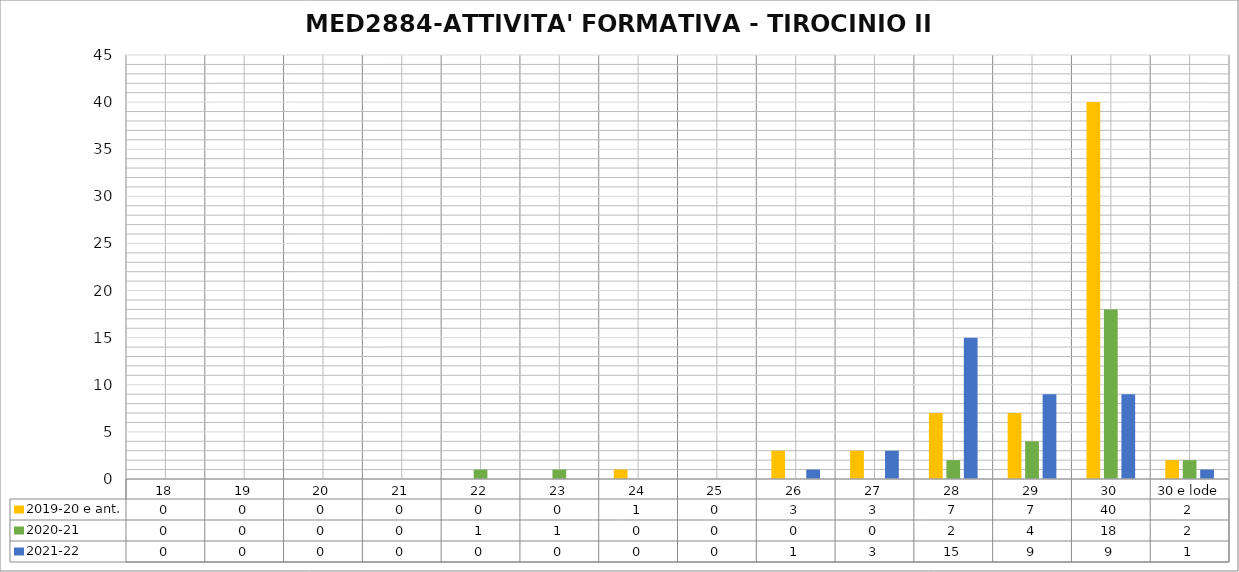
| Category | 2019-20 e ant. | 2020-21 | 2021-22 |
|---|---|---|---|
| 18 | 0 | 0 | 0 |
| 19 | 0 | 0 | 0 |
| 20 | 0 | 0 | 0 |
| 21 | 0 | 0 | 0 |
| 22 | 0 | 1 | 0 |
| 23 | 0 | 1 | 0 |
| 24 | 1 | 0 | 0 |
| 25 | 0 | 0 | 0 |
| 26 | 3 | 0 | 1 |
| 27 | 3 | 0 | 3 |
| 28 | 7 | 2 | 15 |
| 29 | 7 | 4 | 9 |
| 30 | 40 | 18 | 9 |
| 30 e lode | 2 | 2 | 1 |